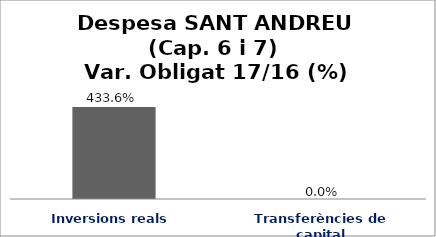
| Category | Series 0 |
|---|---|
| Inversions reals | 4.336 |
| Transferències de capital | 0 |